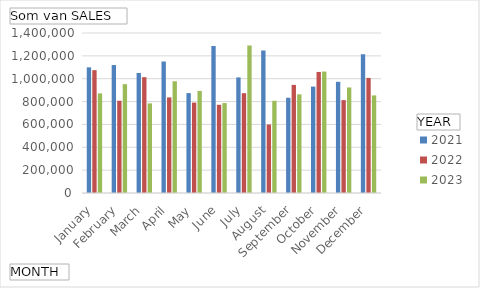
| Category | 2021 | 2022 | 2023 |
|---|---|---|---|
| January | 1099372 | 1074820 | 871546 |
| February | 1119642 | 807257 | 952503 |
| March | 1050006 | 1013466 | 784136 |
| April | 1149533 | 836559 | 977992 |
| May | 874199 | 791095 | 893039 |
| June | 1285265 | 771976 | 786918 |
| July | 1011337 | 873543 | 1290730 |
| August | 1247882 | 599246 | 806769 |
| September | 833494 | 945849 | 863089 |
| October | 931193 | 1059308 | 1062646 |
| November | 973066 | 812659 | 923402 |
| December | 1215004 | 1006745 | 854090 |